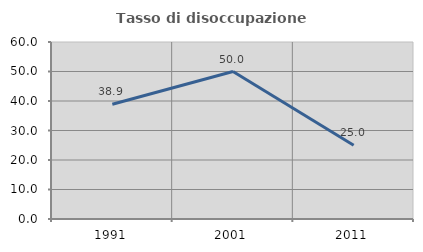
| Category | Tasso di disoccupazione giovanile  |
|---|---|
| 1991.0 | 38.889 |
| 2001.0 | 50 |
| 2011.0 | 25 |